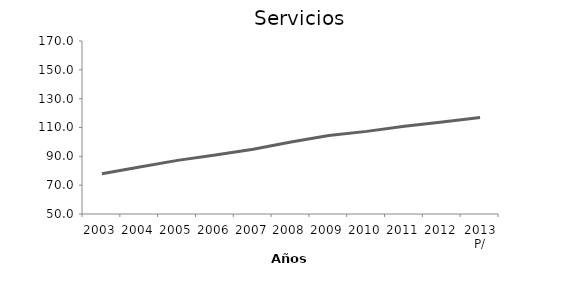
| Category | Servicios |
|---|---|
| 2003 | 77.93 |
| 2004 | 82.578 |
| 2005 | 87.186 |
| 2006 | 90.99 |
| 2007 | 94.863 |
| 2008 | 100 |
| 2009 | 104.413 |
| 2010 | 107.318 |
| 2011 | 110.882 |
| 2012 | 113.875 |
| 2013 P/ | 116.889 |